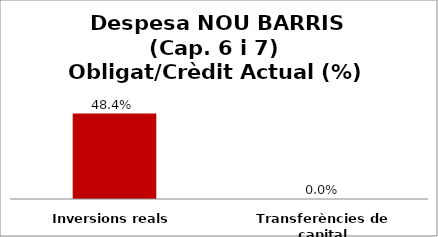
| Category | Series 0 |
|---|---|
| Inversions reals | 0.484 |
| Transferències de capital | 0 |